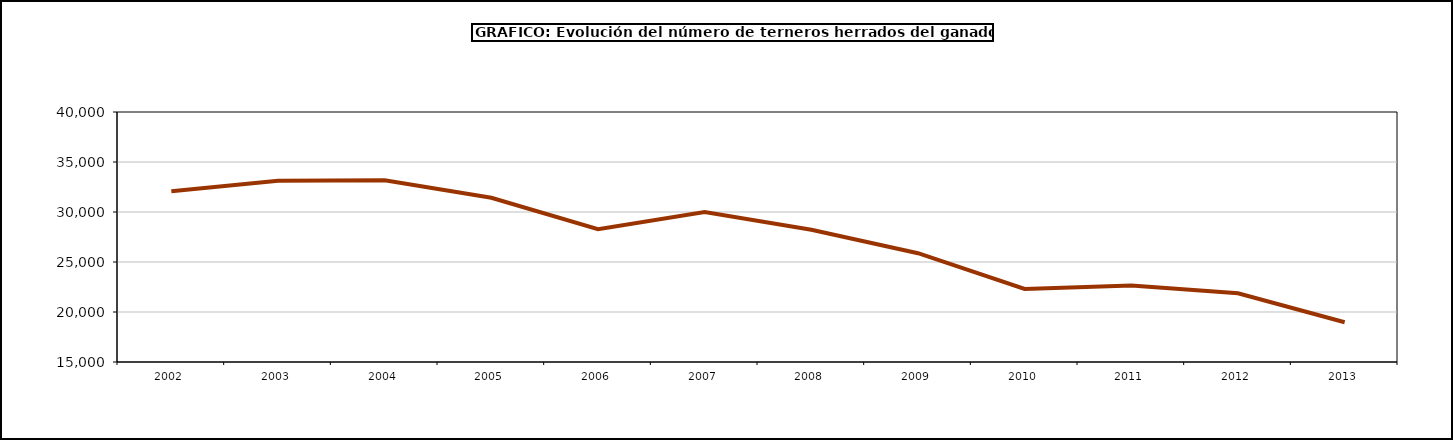
| Category | Ganado de Lidia |
|---|---|
| 2002.0 | 32070 |
| 2003.0 | 33123 |
| 2004.0 | 33165 |
| 2005.0 | 31424 |
| 2006.0 | 28279 |
| 2007.0 | 29996 |
| 2008.0 | 28229 |
| 2009.0 | 25880 |
| 2010.0 | 22300 |
| 2011.0 | 22647 |
| 2012.0 | 21875 |
| 2013.0 | 18973 |